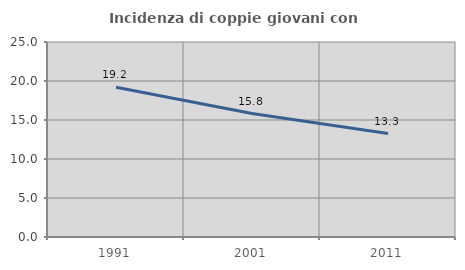
| Category | Incidenza di coppie giovani con figli |
|---|---|
| 1991.0 | 19.202 |
| 2001.0 | 15.83 |
| 2011.0 | 13.269 |